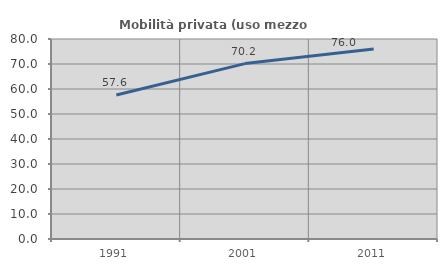
| Category | Mobilità privata (uso mezzo privato) |
|---|---|
| 1991.0 | 57.588 |
| 2001.0 | 70.164 |
| 2011.0 | 75.962 |